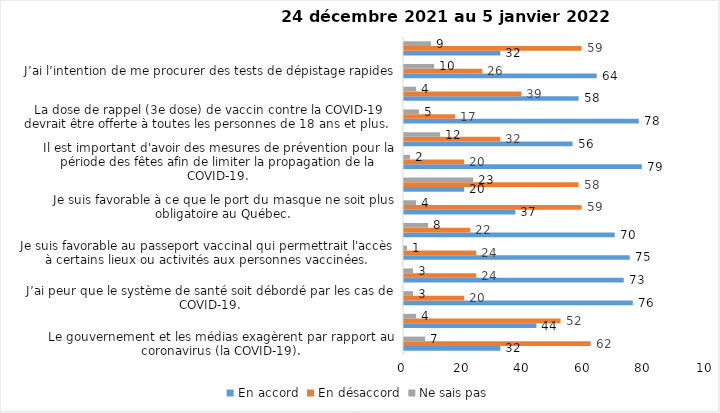
| Category | En accord | En désaccord | Ne sais pas |
|---|---|---|---|
| Le gouvernement et les médias exagèrent par rapport au coronavirus (la COVID-19). | 32 | 62 | 7 |
| Je suis favorable à la mise en place d’un couvre-feu. | 44 | 52 | 4 |
| J’ai peur que le système de santé soit débordé par les cas de COVID-19. | 76 | 20 | 3 |
| Je suis inquiet/inquiète que le nombre de cas augmente en raison des nouveaux variants du virus de la COVID-19. | 73 | 24 | 3 |
| Je suis favorable au passeport vaccinal qui permettrait l'accès à certains lieux ou activités aux personnes vaccinées. | 75 | 24 | 1 |
| Je suis confiant que la vaccination protège efficacement contre les variants de la COVID-19 | 70 | 22 | 8 |
| Je suis favorable à ce que le port du masque ne soit plus obligatoire au Québec. | 37 | 59 | 4 |
| La vaccination des enfants entre 5 et 11 ans mettra fin à la pandémie. | 20 | 58 | 23 |
| Il est important d'avoir des mesures de prévention pour la période des fêtes afin de limiter la propagation de la COVID-19. | 79 | 20 | 2 |
| La pandémie ne sera pas terminée au Québec avant que tous les habitants de la terre puissent être vaccinés contre la COVID-19.   | 56 | 32 | 12 |
| La dose de rappel (3e dose) de vaccin contre la COVID-19 devrait être offerte à toutes les personnes de 18 ans et plus.  | 78 | 17 | 5 |
| Je suis inconfortable d’être en contact avec une personne non vaccinée contre la COVID-19 | 58 | 39 | 4 |
| J’ai l’intention de me procurer des tests de dépistage rapides | 64 | 26 | 10 |
| Je n'ai pas peur du variant Omicron, car il semble moins dangereux pour la santé. | 32 | 59 | 9 |